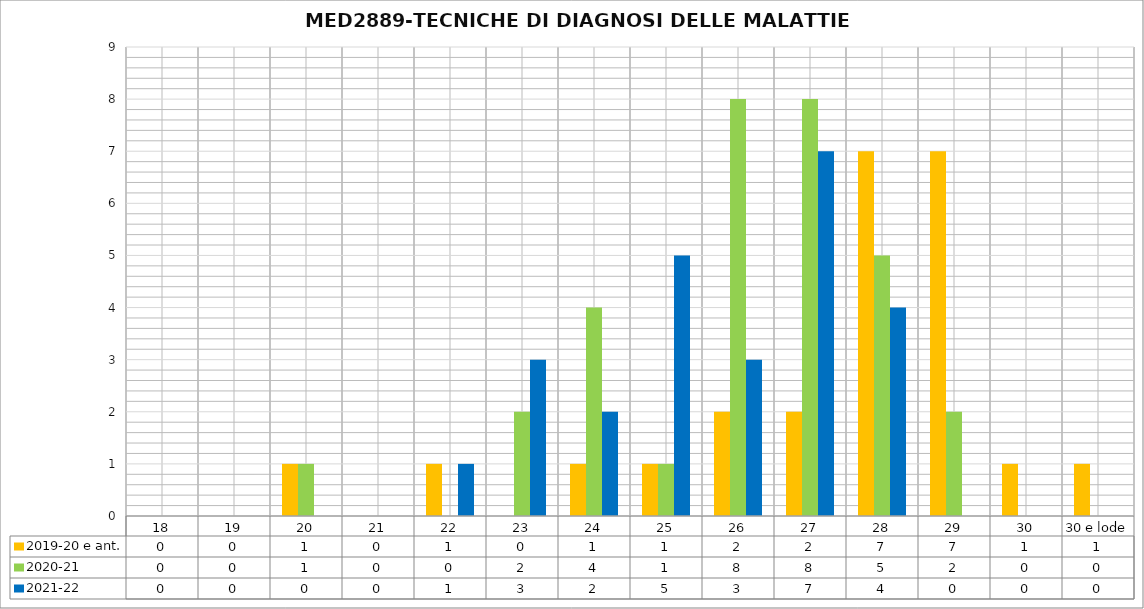
| Category | 2019-20 e ant. | 2020-21 | 2021-22 |
|---|---|---|---|
| 18 | 0 | 0 | 0 |
| 19 | 0 | 0 | 0 |
| 20 | 1 | 1 | 0 |
| 21 | 0 | 0 | 0 |
| 22 | 1 | 0 | 1 |
| 23 | 0 | 2 | 3 |
| 24 | 1 | 4 | 2 |
| 25 | 1 | 1 | 5 |
| 26 | 2 | 8 | 3 |
| 27 | 2 | 8 | 7 |
| 28 | 7 | 5 | 4 |
| 29 | 7 | 2 | 0 |
| 30 | 1 | 0 | 0 |
| 30 e lode | 1 | 0 | 0 |